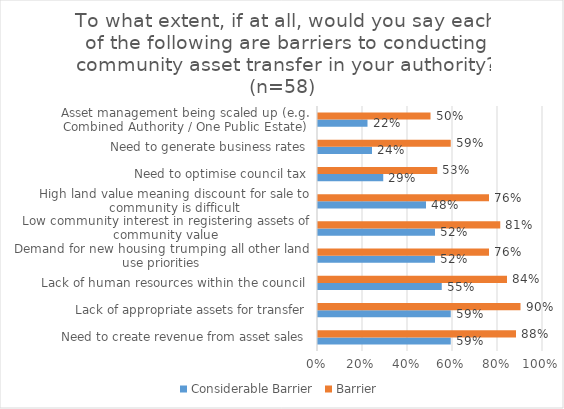
| Category | Considerable Barrier | Barrier |
|---|---|---|
| Need to create revenue from asset sales | 0.59 | 0.88 |
| Lack of appropriate assets for transfer | 0.59 | 0.9 |
| Lack of human resources within the council  | 0.55 | 0.84 |
| Demand for new housing trumping all other land use priorities | 0.52 | 0.76 |
| Low community interest in registering assets of community value | 0.52 | 0.81 |
| High land value meaning discount for sale to community is difficult | 0.48 | 0.76 |
| Need to optimise council tax | 0.29 | 0.53 |
| Need to generate business rates | 0.24 | 0.59 |
| Asset management being scaled up (e.g. Combined Authority / One Public Estate) | 0.22 | 0.5 |